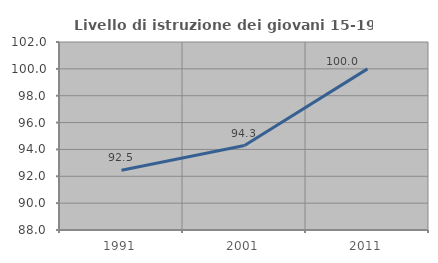
| Category | Livello di istruzione dei giovani 15-19 anni |
|---|---|
| 1991.0 | 92.453 |
| 2001.0 | 94.286 |
| 2011.0 | 100 |